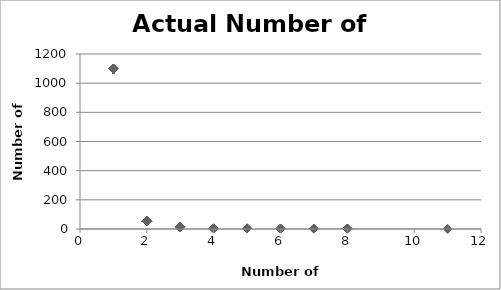
| Category | Actual Number of Athletes |
|---|---|
| 11.0 | 1 |
| 8.0 | 3 |
| 8.0 | 3 |
| 8.0 | 3 |
| 7.0 | 3 |
| 7.0 | 3 |
| 7.0 | 3 |
| 6.0 | 3 |
| 6.0 | 3 |
| 6.0 | 3 |
| 5.0 | 4 |
| 5.0 | 4 |
| 5.0 | 4 |
| 5.0 | 4 |
| 4.0 | 4 |
| 4.0 | 4 |
| 4.0 | 4 |
| 4.0 | 4 |
| 3.0 | 14 |
| 3.0 | 14 |
| 3.0 | 14 |
| 3.0 | 14 |
| 3.0 | 14 |
| 3.0 | 14 |
| 3.0 | 14 |
| 3.0 | 14 |
| 3.0 | 14 |
| 3.0 | 14 |
| 3.0 | 14 |
| 3.0 | 14 |
| 3.0 | 14 |
| 3.0 | 14 |
| 2.0 | 53 |
| 2.0 | 53 |
| 2.0 | 53 |
| 2.0 | 53 |
| 2.0 | 53 |
| 2.0 | 53 |
| 2.0 | 53 |
| 2.0 | 53 |
| 2.0 | 53 |
| 2.0 | 53 |
| 2.0 | 53 |
| 2.0 | 53 |
| 2.0 | 53 |
| 2.0 | 53 |
| 2.0 | 53 |
| 2.0 | 53 |
| 2.0 | 53 |
| 2.0 | 53 |
| 2.0 | 53 |
| 2.0 | 53 |
| 2.0 | 53 |
| 2.0 | 53 |
| 2.0 | 53 |
| 2.0 | 53 |
| 2.0 | 53 |
| 2.0 | 53 |
| 2.0 | 53 |
| 2.0 | 53 |
| 2.0 | 53 |
| 2.0 | 53 |
| 2.0 | 53 |
| 2.0 | 53 |
| 2.0 | 53 |
| 2.0 | 53 |
| 2.0 | 53 |
| 2.0 | 53 |
| 2.0 | 53 |
| 2.0 | 53 |
| 2.0 | 53 |
| 2.0 | 53 |
| 2.0 | 53 |
| 2.0 | 53 |
| 2.0 | 53 |
| 2.0 | 53 |
| 2.0 | 53 |
| 2.0 | 53 |
| 2.0 | 53 |
| 2.0 | 53 |
| 2.0 | 53 |
| 2.0 | 53 |
| 2.0 | 53 |
| 2.0 | 53 |
| 2.0 | 53 |
| 1.0 | 1098 |
| 1.0 | 1098 |
| 1.0 | 1098 |
| 1.0 | 1098 |
| 1.0 | 1098 |
| 1.0 | 1098 |
| 1.0 | 1098 |
| 1.0 | 1098 |
| 1.0 | 1098 |
| 1.0 | 1098 |
| 1.0 | 1098 |
| 1.0 | 1098 |
| 1.0 | 1098 |
| 1.0 | 1098 |
| 1.0 | 1098 |
| 1.0 | 1098 |
| 1.0 | 1098 |
| 1.0 | 1098 |
| 1.0 | 1098 |
| 1.0 | 1098 |
| 1.0 | 1098 |
| 1.0 | 1098 |
| 1.0 | 1098 |
| 1.0 | 1098 |
| 1.0 | 1098 |
| 1.0 | 1098 |
| 1.0 | 1098 |
| 1.0 | 1098 |
| 1.0 | 1098 |
| 1.0 | 1098 |
| 1.0 | 1098 |
| 1.0 | 1098 |
| 1.0 | 1098 |
| 1.0 | 1098 |
| 1.0 | 1098 |
| 1.0 | 1098 |
| 1.0 | 1098 |
| 1.0 | 1098 |
| 1.0 | 1098 |
| 1.0 | 1098 |
| 1.0 | 1098 |
| 1.0 | 1098 |
| 1.0 | 1098 |
| 1.0 | 1098 |
| 1.0 | 1098 |
| 1.0 | 1098 |
| 1.0 | 1098 |
| 1.0 | 1098 |
| 1.0 | 1098 |
| 1.0 | 1098 |
| 1.0 | 1098 |
| 1.0 | 1098 |
| 1.0 | 1098 |
| 1.0 | 1098 |
| 1.0 | 1098 |
| 1.0 | 1098 |
| 1.0 | 1098 |
| 1.0 | 1098 |
| 1.0 | 1098 |
| 1.0 | 1098 |
| 1.0 | 1098 |
| 1.0 | 1098 |
| 1.0 | 1098 |
| 1.0 | 1098 |
| 1.0 | 1098 |
| 1.0 | 1098 |
| 1.0 | 1098 |
| 1.0 | 1098 |
| 1.0 | 1098 |
| 1.0 | 1098 |
| 1.0 | 1098 |
| 1.0 | 1098 |
| 1.0 | 1098 |
| 1.0 | 1098 |
| 1.0 | 1098 |
| 1.0 | 1098 |
| 1.0 | 1098 |
| 1.0 | 1098 |
| 1.0 | 1098 |
| 1.0 | 1098 |
| 1.0 | 1098 |
| 1.0 | 1098 |
| 1.0 | 1098 |
| 1.0 | 1098 |
| 1.0 | 1098 |
| 1.0 | 1098 |
| 1.0 | 1098 |
| 1.0 | 1098 |
| 1.0 | 1098 |
| 1.0 | 1098 |
| 1.0 | 1098 |
| 1.0 | 1098 |
| 1.0 | 1098 |
| 1.0 | 1098 |
| 1.0 | 1098 |
| 1.0 | 1098 |
| 1.0 | 1098 |
| 1.0 | 1098 |
| 1.0 | 1098 |
| 1.0 | 1098 |
| 1.0 | 1098 |
| 1.0 | 1098 |
| 1.0 | 1098 |
| 1.0 | 1098 |
| 1.0 | 1098 |
| 1.0 | 1098 |
| 1.0 | 1098 |
| 1.0 | 1098 |
| 1.0 | 1098 |
| 1.0 | 1098 |
| 1.0 | 1098 |
| 1.0 | 1098 |
| 1.0 | 1098 |
| 1.0 | 1098 |
| 1.0 | 1098 |
| 1.0 | 1098 |
| 1.0 | 1098 |
| 1.0 | 1098 |
| 1.0 | 1098 |
| 1.0 | 1098 |
| 1.0 | 1098 |
| 1.0 | 1098 |
| 1.0 | 1098 |
| 1.0 | 1098 |
| 1.0 | 1098 |
| 1.0 | 1098 |
| 1.0 | 1098 |
| 1.0 | 1098 |
| 1.0 | 1098 |
| 1.0 | 1098 |
| 1.0 | 1098 |
| 1.0 | 1098 |
| 1.0 | 1098 |
| 1.0 | 1098 |
| 1.0 | 1098 |
| 1.0 | 1098 |
| 1.0 | 1098 |
| 1.0 | 1098 |
| 1.0 | 1098 |
| 1.0 | 1098 |
| 1.0 | 1098 |
| 1.0 | 1098 |
| 1.0 | 1098 |
| 1.0 | 1098 |
| 1.0 | 1098 |
| 1.0 | 1098 |
| 1.0 | 1098 |
| 1.0 | 1098 |
| 1.0 | 1098 |
| 1.0 | 1098 |
| 1.0 | 1098 |
| 1.0 | 1098 |
| 1.0 | 1098 |
| 1.0 | 1098 |
| 1.0 | 1098 |
| 1.0 | 1098 |
| 1.0 | 1098 |
| 1.0 | 1098 |
| 1.0 | 1098 |
| 1.0 | 1098 |
| 1.0 | 1098 |
| 1.0 | 1098 |
| 1.0 | 1098 |
| 1.0 | 1098 |
| 1.0 | 1098 |
| 1.0 | 1098 |
| 1.0 | 1098 |
| 1.0 | 1098 |
| 1.0 | 1098 |
| 1.0 | 1098 |
| 1.0 | 1098 |
| 1.0 | 1098 |
| 1.0 | 1098 |
| 1.0 | 1098 |
| 1.0 | 1098 |
| 1.0 | 1098 |
| 1.0 | 1098 |
| 1.0 | 1098 |
| 1.0 | 1098 |
| 1.0 | 1098 |
| 1.0 | 1098 |
| 1.0 | 1098 |
| 1.0 | 1098 |
| 1.0 | 1098 |
| 1.0 | 1098 |
| 1.0 | 1098 |
| 1.0 | 1098 |
| 1.0 | 1098 |
| 1.0 | 1098 |
| 1.0 | 1098 |
| 1.0 | 1098 |
| 1.0 | 1098 |
| 1.0 | 1098 |
| 1.0 | 1098 |
| 1.0 | 1098 |
| 1.0 | 1098 |
| 1.0 | 1098 |
| 1.0 | 1098 |
| 1.0 | 1098 |
| 1.0 | 1098 |
| 1.0 | 1098 |
| 1.0 | 1098 |
| 1.0 | 1098 |
| 1.0 | 1098 |
| 1.0 | 1098 |
| 1.0 | 1098 |
| 1.0 | 1098 |
| 1.0 | 1098 |
| 1.0 | 1098 |
| 1.0 | 1098 |
| 1.0 | 1098 |
| 1.0 | 1098 |
| 1.0 | 1098 |
| 1.0 | 1098 |
| 1.0 | 1098 |
| 1.0 | 1098 |
| 1.0 | 1098 |
| 1.0 | 1098 |
| 1.0 | 1098 |
| 1.0 | 1098 |
| 1.0 | 1098 |
| 1.0 | 1098 |
| 1.0 | 1098 |
| 1.0 | 1098 |
| 1.0 | 1098 |
| 1.0 | 1098 |
| 1.0 | 1098 |
| 1.0 | 1098 |
| 1.0 | 1098 |
| 1.0 | 1098 |
| 1.0 | 1098 |
| 1.0 | 1098 |
| 1.0 | 1098 |
| 1.0 | 1098 |
| 1.0 | 1098 |
| 1.0 | 1098 |
| 1.0 | 1098 |
| 1.0 | 1098 |
| 1.0 | 1098 |
| 1.0 | 1098 |
| 1.0 | 1098 |
| 1.0 | 1098 |
| 1.0 | 1098 |
| 1.0 | 1098 |
| 1.0 | 1098 |
| 1.0 | 1098 |
| 1.0 | 1098 |
| 1.0 | 1098 |
| 1.0 | 1098 |
| 1.0 | 1098 |
| 1.0 | 1098 |
| 1.0 | 1098 |
| 1.0 | 1098 |
| 1.0 | 1098 |
| 1.0 | 1098 |
| 1.0 | 1098 |
| 1.0 | 1098 |
| 1.0 | 1098 |
| 1.0 | 1098 |
| 1.0 | 1098 |
| 1.0 | 1098 |
| 1.0 | 1098 |
| 1.0 | 1098 |
| 1.0 | 1098 |
| 1.0 | 1098 |
| 1.0 | 1098 |
| 1.0 | 1098 |
| 1.0 | 1098 |
| 1.0 | 1098 |
| 1.0 | 1098 |
| 1.0 | 1098 |
| 1.0 | 1098 |
| 1.0 | 1098 |
| 1.0 | 1098 |
| 1.0 | 1098 |
| 1.0 | 1098 |
| 1.0 | 1098 |
| 1.0 | 1098 |
| 1.0 | 1098 |
| 1.0 | 1098 |
| 1.0 | 1098 |
| 1.0 | 1098 |
| 1.0 | 1098 |
| 1.0 | 1098 |
| 1.0 | 1098 |
| 1.0 | 1098 |
| 1.0 | 1098 |
| 1.0 | 1098 |
| 1.0 | 1098 |
| 1.0 | 1098 |
| 1.0 | 1098 |
| 1.0 | 1098 |
| 1.0 | 1098 |
| 1.0 | 1098 |
| 1.0 | 1098 |
| 1.0 | 1098 |
| 1.0 | 1098 |
| 1.0 | 1098 |
| 1.0 | 1098 |
| 1.0 | 1098 |
| 1.0 | 1098 |
| 1.0 | 1098 |
| 1.0 | 1098 |
| 1.0 | 1098 |
| 1.0 | 1098 |
| 1.0 | 1098 |
| 1.0 | 1098 |
| 1.0 | 1098 |
| 1.0 | 1098 |
| 1.0 | 1098 |
| 1.0 | 1098 |
| 1.0 | 1098 |
| 1.0 | 1098 |
| 1.0 | 1098 |
| 1.0 | 1098 |
| 1.0 | 1098 |
| 1.0 | 1098 |
| 1.0 | 1098 |
| 1.0 | 1098 |
| 1.0 | 1098 |
| 1.0 | 1098 |
| 1.0 | 1098 |
| 1.0 | 1098 |
| 1.0 | 1098 |
| 1.0 | 1098 |
| 1.0 | 1098 |
| 1.0 | 1098 |
| 1.0 | 1098 |
| 1.0 | 1098 |
| 1.0 | 1098 |
| 1.0 | 1098 |
| 1.0 | 1098 |
| 1.0 | 1098 |
| 1.0 | 1098 |
| 1.0 | 1098 |
| 1.0 | 1098 |
| 1.0 | 1098 |
| 1.0 | 1098 |
| 1.0 | 1098 |
| 1.0 | 1098 |
| 1.0 | 1098 |
| 1.0 | 1098 |
| 1.0 | 1098 |
| 1.0 | 1098 |
| 1.0 | 1098 |
| 1.0 | 1098 |
| 1.0 | 1098 |
| 1.0 | 1098 |
| 1.0 | 1098 |
| 1.0 | 1098 |
| 1.0 | 1098 |
| 1.0 | 1098 |
| 1.0 | 1098 |
| 1.0 | 1098 |
| 1.0 | 1098 |
| 1.0 | 1098 |
| 1.0 | 1098 |
| 1.0 | 1098 |
| 1.0 | 1098 |
| 1.0 | 1098 |
| 1.0 | 1098 |
| 1.0 | 1098 |
| 1.0 | 1098 |
| 1.0 | 1098 |
| 1.0 | 1098 |
| 1.0 | 1098 |
| 1.0 | 1098 |
| 1.0 | 1098 |
| 1.0 | 1098 |
| 1.0 | 1098 |
| 1.0 | 1098 |
| 1.0 | 1098 |
| 1.0 | 1098 |
| 1.0 | 1098 |
| 1.0 | 1098 |
| 1.0 | 1098 |
| 1.0 | 1098 |
| 1.0 | 1098 |
| 1.0 | 1098 |
| 1.0 | 1098 |
| 1.0 | 1098 |
| 1.0 | 1098 |
| 1.0 | 1098 |
| 1.0 | 1098 |
| 1.0 | 1098 |
| 1.0 | 1098 |
| 1.0 | 1098 |
| 1.0 | 1098 |
| 1.0 | 1098 |
| 1.0 | 1098 |
| 1.0 | 1098 |
| 1.0 | 1098 |
| 1.0 | 1098 |
| 1.0 | 1098 |
| 1.0 | 1098 |
| 1.0 | 1098 |
| 1.0 | 1098 |
| 1.0 | 1098 |
| 1.0 | 1098 |
| 1.0 | 1098 |
| 1.0 | 1098 |
| 1.0 | 1098 |
| 1.0 | 1098 |
| 1.0 | 1098 |
| 1.0 | 1098 |
| 1.0 | 1098 |
| 1.0 | 1098 |
| 1.0 | 1098 |
| 1.0 | 1098 |
| 1.0 | 1098 |
| 1.0 | 1098 |
| 1.0 | 1098 |
| 1.0 | 1098 |
| 1.0 | 1098 |
| 1.0 | 1098 |
| 1.0 | 1098 |
| 1.0 | 1098 |
| 1.0 | 1098 |
| 1.0 | 1098 |
| 1.0 | 1098 |
| 1.0 | 1098 |
| 1.0 | 1098 |
| 1.0 | 1098 |
| 1.0 | 1098 |
| 1.0 | 1098 |
| 1.0 | 1098 |
| 1.0 | 1098 |
| 1.0 | 1098 |
| 1.0 | 1098 |
| 1.0 | 1098 |
| 1.0 | 1098 |
| 1.0 | 1098 |
| 1.0 | 1098 |
| 1.0 | 1098 |
| 1.0 | 1098 |
| 1.0 | 1098 |
| 1.0 | 1098 |
| 1.0 | 1098 |
| 1.0 | 1098 |
| 1.0 | 1098 |
| 1.0 | 1098 |
| 1.0 | 1098 |
| 1.0 | 1098 |
| 1.0 | 1098 |
| 1.0 | 1098 |
| 1.0 | 1098 |
| 1.0 | 1098 |
| 1.0 | 1098 |
| 1.0 | 1098 |
| 1.0 | 1098 |
| 1.0 | 1098 |
| 1.0 | 1098 |
| 1.0 | 1098 |
| 1.0 | 1098 |
| 1.0 | 1098 |
| 1.0 | 1098 |
| 1.0 | 1098 |
| 1.0 | 1098 |
| 1.0 | 1098 |
| 1.0 | 1098 |
| 1.0 | 1098 |
| 1.0 | 1098 |
| 1.0 | 1098 |
| 1.0 | 1098 |
| 1.0 | 1098 |
| 1.0 | 1098 |
| 1.0 | 1098 |
| 1.0 | 1098 |
| 1.0 | 1098 |
| 1.0 | 1098 |
| 1.0 | 1098 |
| 1.0 | 1098 |
| 1.0 | 1098 |
| 1.0 | 1098 |
| 1.0 | 1098 |
| 1.0 | 1098 |
| 1.0 | 1098 |
| 1.0 | 1098 |
| 1.0 | 1098 |
| 1.0 | 1098 |
| 1.0 | 1098 |
| 1.0 | 1098 |
| 1.0 | 1098 |
| 1.0 | 1098 |
| 1.0 | 1098 |
| 1.0 | 1098 |
| 1.0 | 1098 |
| 1.0 | 1098 |
| 1.0 | 1098 |
| 1.0 | 1098 |
| 1.0 | 1098 |
| 1.0 | 1098 |
| 1.0 | 1098 |
| 1.0 | 1098 |
| 1.0 | 1098 |
| 1.0 | 1098 |
| 1.0 | 1098 |
| 1.0 | 1098 |
| 1.0 | 1098 |
| 1.0 | 1098 |
| 1.0 | 1098 |
| 1.0 | 1098 |
| 1.0 | 1098 |
| 1.0 | 1098 |
| 1.0 | 1098 |
| 1.0 | 1098 |
| 1.0 | 1098 |
| 1.0 | 1098 |
| 1.0 | 1098 |
| 1.0 | 1098 |
| 1.0 | 1098 |
| 1.0 | 1098 |
| 1.0 | 1098 |
| 1.0 | 1098 |
| 1.0 | 1098 |
| 1.0 | 1098 |
| 1.0 | 1098 |
| 1.0 | 1098 |
| 1.0 | 1098 |
| 1.0 | 1098 |
| 1.0 | 1098 |
| 1.0 | 1098 |
| 1.0 | 1098 |
| 1.0 | 1098 |
| 1.0 | 1098 |
| 1.0 | 1098 |
| 1.0 | 1098 |
| 1.0 | 1098 |
| 1.0 | 1098 |
| 1.0 | 1098 |
| 1.0 | 1098 |
| 1.0 | 1098 |
| 1.0 | 1098 |
| 1.0 | 1098 |
| 1.0 | 1098 |
| 1.0 | 1098 |
| 1.0 | 1098 |
| 1.0 | 1098 |
| 1.0 | 1098 |
| 1.0 | 1098 |
| 1.0 | 1098 |
| 1.0 | 1098 |
| 1.0 | 1098 |
| 1.0 | 1098 |
| 1.0 | 1098 |
| 1.0 | 1098 |
| 1.0 | 1098 |
| 1.0 | 1098 |
| 1.0 | 1098 |
| 1.0 | 1098 |
| 1.0 | 1098 |
| 1.0 | 1098 |
| 1.0 | 1098 |
| 1.0 | 1098 |
| 1.0 | 1098 |
| 1.0 | 1098 |
| 1.0 | 1098 |
| 1.0 | 1098 |
| 1.0 | 1098 |
| 1.0 | 1098 |
| 1.0 | 1098 |
| 1.0 | 1098 |
| 1.0 | 1098 |
| 1.0 | 1098 |
| 1.0 | 1098 |
| 1.0 | 1098 |
| 1.0 | 1098 |
| 1.0 | 1098 |
| 1.0 | 1098 |
| 1.0 | 1098 |
| 1.0 | 1098 |
| 1.0 | 1098 |
| 1.0 | 1098 |
| 1.0 | 1098 |
| 1.0 | 1098 |
| 1.0 | 1098 |
| 1.0 | 1098 |
| 1.0 | 1098 |
| 1.0 | 1098 |
| 1.0 | 1098 |
| 1.0 | 1098 |
| 1.0 | 1098 |
| 1.0 | 1098 |
| 1.0 | 1098 |
| 1.0 | 1098 |
| 1.0 | 1098 |
| 1.0 | 1098 |
| 1.0 | 1098 |
| 1.0 | 1098 |
| 1.0 | 1098 |
| 1.0 | 1098 |
| 1.0 | 1098 |
| 1.0 | 1098 |
| 1.0 | 1098 |
| 1.0 | 1098 |
| 1.0 | 1098 |
| 1.0 | 1098 |
| 1.0 | 1098 |
| 1.0 | 1098 |
| 1.0 | 1098 |
| 1.0 | 1098 |
| 1.0 | 1098 |
| 1.0 | 1098 |
| 1.0 | 1098 |
| 1.0 | 1098 |
| 1.0 | 1098 |
| 1.0 | 1098 |
| 1.0 | 1098 |
| 1.0 | 1098 |
| 1.0 | 1098 |
| 1.0 | 1098 |
| 1.0 | 1098 |
| 1.0 | 1098 |
| 1.0 | 1098 |
| 1.0 | 1098 |
| 1.0 | 1098 |
| 1.0 | 1098 |
| 1.0 | 1098 |
| 1.0 | 1098 |
| 1.0 | 1098 |
| 1.0 | 1098 |
| 1.0 | 1098 |
| 1.0 | 1098 |
| 1.0 | 1098 |
| 1.0 | 1098 |
| 1.0 | 1098 |
| 1.0 | 1098 |
| 1.0 | 1098 |
| 1.0 | 1098 |
| 1.0 | 1098 |
| 1.0 | 1098 |
| 1.0 | 1098 |
| 1.0 | 1098 |
| 1.0 | 1098 |
| 1.0 | 1098 |
| 1.0 | 1098 |
| 1.0 | 1098 |
| 1.0 | 1098 |
| 1.0 | 1098 |
| 1.0 | 1098 |
| 1.0 | 1098 |
| 1.0 | 1098 |
| 1.0 | 1098 |
| 1.0 | 1098 |
| 1.0 | 1098 |
| 1.0 | 1098 |
| 1.0 | 1098 |
| 1.0 | 1098 |
| 1.0 | 1098 |
| 1.0 | 1098 |
| 1.0 | 1098 |
| 1.0 | 1098 |
| 1.0 | 1098 |
| 1.0 | 1098 |
| 1.0 | 1098 |
| 1.0 | 1098 |
| 1.0 | 1098 |
| 1.0 | 1098 |
| 1.0 | 1098 |
| 1.0 | 1098 |
| 1.0 | 1098 |
| 1.0 | 1098 |
| 1.0 | 1098 |
| 1.0 | 1098 |
| 1.0 | 1098 |
| 1.0 | 1098 |
| 1.0 | 1098 |
| 1.0 | 1098 |
| 1.0 | 1098 |
| 1.0 | 1098 |
| 1.0 | 1098 |
| 1.0 | 1098 |
| 1.0 | 1098 |
| 1.0 | 1098 |
| 1.0 | 1098 |
| 1.0 | 1098 |
| 1.0 | 1098 |
| 1.0 | 1098 |
| 1.0 | 1098 |
| 1.0 | 1098 |
| 1.0 | 1098 |
| 1.0 | 1098 |
| 1.0 | 1098 |
| 1.0 | 1098 |
| 1.0 | 1098 |
| 1.0 | 1098 |
| 1.0 | 1098 |
| 1.0 | 1098 |
| 1.0 | 1098 |
| 1.0 | 1098 |
| 1.0 | 1098 |
| 1.0 | 1098 |
| 1.0 | 1098 |
| 1.0 | 1098 |
| 1.0 | 1098 |
| 1.0 | 1098 |
| 1.0 | 1098 |
| 1.0 | 1098 |
| 1.0 | 1098 |
| 1.0 | 1098 |
| 1.0 | 1098 |
| 1.0 | 1098 |
| 1.0 | 1098 |
| 1.0 | 1098 |
| 1.0 | 1098 |
| 1.0 | 1098 |
| 1.0 | 1098 |
| 1.0 | 1098 |
| 1.0 | 1098 |
| 1.0 | 1098 |
| 1.0 | 1098 |
| 1.0 | 1098 |
| 1.0 | 1098 |
| 1.0 | 1098 |
| 1.0 | 1098 |
| 1.0 | 1098 |
| 1.0 | 1098 |
| 1.0 | 1098 |
| 1.0 | 1098 |
| 1.0 | 1098 |
| 1.0 | 1098 |
| 1.0 | 1098 |
| 1.0 | 1098 |
| 1.0 | 1098 |
| 1.0 | 1098 |
| 1.0 | 1098 |
| 1.0 | 1098 |
| 1.0 | 1098 |
| 1.0 | 1098 |
| 1.0 | 1098 |
| 1.0 | 1098 |
| 1.0 | 1098 |
| 1.0 | 1098 |
| 1.0 | 1098 |
| 1.0 | 1098 |
| 1.0 | 1098 |
| 1.0 | 1098 |
| 1.0 | 1098 |
| 1.0 | 1098 |
| 1.0 | 1098 |
| 1.0 | 1098 |
| 1.0 | 1098 |
| 1.0 | 1098 |
| 1.0 | 1098 |
| 1.0 | 1098 |
| 1.0 | 1098 |
| 1.0 | 1098 |
| 1.0 | 1098 |
| 1.0 | 1098 |
| 1.0 | 1098 |
| 1.0 | 1098 |
| 1.0 | 1098 |
| 1.0 | 1098 |
| 1.0 | 1098 |
| 1.0 | 1098 |
| 1.0 | 1098 |
| 1.0 | 1098 |
| 1.0 | 1098 |
| 1.0 | 1098 |
| 1.0 | 1098 |
| 1.0 | 1098 |
| 1.0 | 1098 |
| 1.0 | 1098 |
| 1.0 | 1098 |
| 1.0 | 1098 |
| 1.0 | 1098 |
| 1.0 | 1098 |
| 1.0 | 1098 |
| 1.0 | 1098 |
| 1.0 | 1098 |
| 1.0 | 1098 |
| 1.0 | 1098 |
| 1.0 | 1098 |
| 1.0 | 1098 |
| 1.0 | 1098 |
| 1.0 | 1098 |
| 1.0 | 1098 |
| 1.0 | 1098 |
| 1.0 | 1098 |
| 1.0 | 1098 |
| 1.0 | 1098 |
| 1.0 | 1098 |
| 1.0 | 1098 |
| 1.0 | 1098 |
| 1.0 | 1098 |
| 1.0 | 1098 |
| 1.0 | 1098 |
| 1.0 | 1098 |
| 1.0 | 1098 |
| 1.0 | 1098 |
| 1.0 | 1098 |
| 1.0 | 1098 |
| 1.0 | 1098 |
| 1.0 | 1098 |
| 1.0 | 1098 |
| 1.0 | 1098 |
| 1.0 | 1098 |
| 1.0 | 1098 |
| 1.0 | 1098 |
| 1.0 | 1098 |
| 1.0 | 1098 |
| 1.0 | 1098 |
| 1.0 | 1098 |
| 1.0 | 1098 |
| 1.0 | 1098 |
| 1.0 | 1098 |
| 1.0 | 1098 |
| 1.0 | 1098 |
| 1.0 | 1098 |
| 1.0 | 1098 |
| 1.0 | 1098 |
| 1.0 | 1098 |
| 1.0 | 1098 |
| 1.0 | 1098 |
| 1.0 | 1098 |
| 1.0 | 1098 |
| 1.0 | 1098 |
| 1.0 | 1098 |
| 1.0 | 1098 |
| 1.0 | 1098 |
| 1.0 | 1098 |
| 1.0 | 1098 |
| 1.0 | 1098 |
| 1.0 | 1098 |
| 1.0 | 1098 |
| 1.0 | 1098 |
| 1.0 | 1098 |
| 1.0 | 1098 |
| 1.0 | 1098 |
| 1.0 | 1098 |
| 1.0 | 1098 |
| 1.0 | 1098 |
| 1.0 | 1098 |
| 1.0 | 1098 |
| 1.0 | 1098 |
| 1.0 | 1098 |
| 1.0 | 1098 |
| 1.0 | 1098 |
| 1.0 | 1098 |
| 1.0 | 1098 |
| 1.0 | 1098 |
| 1.0 | 1098 |
| 1.0 | 1098 |
| 1.0 | 1098 |
| 1.0 | 1098 |
| 1.0 | 1098 |
| 1.0 | 1098 |
| 1.0 | 1098 |
| 1.0 | 1098 |
| 1.0 | 1098 |
| 1.0 | 1098 |
| 1.0 | 1098 |
| 1.0 | 1098 |
| 1.0 | 1098 |
| 1.0 | 1098 |
| 1.0 | 1098 |
| 1.0 | 1098 |
| 1.0 | 1098 |
| 1.0 | 1098 |
| 1.0 | 1098 |
| 1.0 | 1098 |
| 1.0 | 1098 |
| 1.0 | 1098 |
| 1.0 | 1098 |
| 1.0 | 1098 |
| 1.0 | 1098 |
| 1.0 | 1098 |
| 1.0 | 1098 |
| 1.0 | 1098 |
| 1.0 | 1098 |
| 1.0 | 1098 |
| 1.0 | 1098 |
| 1.0 | 1098 |
| 1.0 | 1098 |
| 1.0 | 1098 |
| 1.0 | 1098 |
| 1.0 | 1098 |
| 1.0 | 1098 |
| 1.0 | 1098 |
| 1.0 | 1098 |
| 1.0 | 1098 |
| 1.0 | 1098 |
| 1.0 | 1098 |
| 1.0 | 1098 |
| 1.0 | 1098 |
| 1.0 | 1098 |
| 1.0 | 1098 |
| 1.0 | 1098 |
| 1.0 | 1098 |
| 1.0 | 1098 |
| 1.0 | 1098 |
| 1.0 | 1098 |
| 1.0 | 1098 |
| 1.0 | 1098 |
| 1.0 | 1098 |
| 1.0 | 1098 |
| 1.0 | 1098 |
| 1.0 | 1098 |
| 1.0 | 1098 |
| 1.0 | 1098 |
| 1.0 | 1098 |
| 1.0 | 1098 |
| 1.0 | 1098 |
| 1.0 | 1098 |
| 1.0 | 1098 |
| 1.0 | 1098 |
| 1.0 | 1098 |
| 1.0 | 1098 |
| 1.0 | 1098 |
| 1.0 | 1098 |
| 1.0 | 1098 |
| 1.0 | 1098 |
| 1.0 | 1098 |
| 1.0 | 1098 |
| 1.0 | 1098 |
| 1.0 | 1098 |
| 1.0 | 1098 |
| 1.0 | 1098 |
| 1.0 | 1098 |
| 1.0 | 1098 |
| 1.0 | 1098 |
| 1.0 | 1098 |
| 1.0 | 1098 |
| 1.0 | 1098 |
| 1.0 | 1098 |
| 1.0 | 1098 |
| 1.0 | 1098 |
| 1.0 | 1098 |
| 1.0 | 1098 |
| 1.0 | 1098 |
| 1.0 | 1098 |
| 1.0 | 1098 |
| 1.0 | 1098 |
| 1.0 | 1098 |
| 1.0 | 1098 |
| 1.0 | 1098 |
| 1.0 | 1098 |
| 1.0 | 1098 |
| 1.0 | 1098 |
| 1.0 | 1098 |
| 1.0 | 1098 |
| 1.0 | 1098 |
| 1.0 | 1098 |
| 1.0 | 1098 |
| 1.0 | 1098 |
| 1.0 | 1098 |
| 1.0 | 1098 |
| 1.0 | 1098 |
| 1.0 | 1098 |
| 1.0 | 1098 |
| 1.0 | 1098 |
| 1.0 | 1098 |
| 1.0 | 1098 |
| 1.0 | 1098 |
| 1.0 | 1098 |
| 1.0 | 1098 |
| 1.0 | 1098 |
| 1.0 | 1098 |
| 1.0 | 1098 |
| 1.0 | 1098 |
| 1.0 | 1098 |
| 1.0 | 1098 |
| 1.0 | 1098 |
| 1.0 | 1098 |
| 1.0 | 1098 |
| 1.0 | 1098 |
| 1.0 | 1098 |
| 1.0 | 1098 |
| 1.0 | 1098 |
| 1.0 | 1098 |
| 1.0 | 1098 |
| 1.0 | 1098 |
| 1.0 | 1098 |
| 1.0 | 1098 |
| 1.0 | 1098 |
| 1.0 | 1098 |
| 1.0 | 1098 |
| 1.0 | 1098 |
| 1.0 | 1098 |
| 1.0 | 1098 |
| 1.0 | 1098 |
| 1.0 | 1098 |
| 1.0 | 1098 |
| 1.0 | 1098 |
| 1.0 | 1098 |
| 1.0 | 1098 |
| 1.0 | 1098 |
| 1.0 | 1098 |
| 1.0 | 1098 |
| 1.0 | 1098 |
| 1.0 | 1098 |
| 1.0 | 1098 |
| 1.0 | 1098 |
| 1.0 | 1098 |
| 1.0 | 1098 |
| 1.0 | 1098 |
| 1.0 | 1098 |
| 1.0 | 1098 |
| 1.0 | 1098 |
| 1.0 | 1098 |
| 1.0 | 1098 |
| 1.0 | 1098 |
| 1.0 | 1098 |
| 1.0 | 1098 |
| 1.0 | 1098 |
| 1.0 | 1098 |
| 1.0 | 1098 |
| 1.0 | 1098 |
| 1.0 | 1098 |
| 1.0 | 1098 |
| 1.0 | 1098 |
| 1.0 | 1098 |
| 1.0 | 1098 |
| 1.0 | 1098 |
| 1.0 | 1098 |
| 1.0 | 1098 |
| 1.0 | 1098 |
| 1.0 | 1098 |
| 1.0 | 1098 |
| 1.0 | 1098 |
| 1.0 | 1098 |
| 1.0 | 1098 |
| 1.0 | 1098 |
| 1.0 | 1098 |
| 1.0 | 1098 |
| 1.0 | 1098 |
| 1.0 | 1098 |
| 1.0 | 1098 |
| 1.0 | 1098 |
| 1.0 | 1098 |
| 1.0 | 1098 |
| 1.0 | 1098 |
| 1.0 | 1098 |
| 1.0 | 1098 |
| 1.0 | 1098 |
| 1.0 | 1098 |
| 1.0 | 1098 |
| 1.0 | 1098 |
| 1.0 | 1098 |
| 1.0 | 1098 |
| 1.0 | 1098 |
| 1.0 | 1098 |
| 1.0 | 1098 |
| 1.0 | 1098 |
| 1.0 | 1098 |
| 1.0 | 1098 |
| 1.0 | 1098 |
| 1.0 | 1098 |
| 1.0 | 1098 |
| 1.0 | 1098 |
| 1.0 | 1098 |
| 1.0 | 1098 |
| 1.0 | 1098 |
| 1.0 | 1098 |
| 1.0 | 1098 |
| 1.0 | 1098 |
| 1.0 | 1098 |
| 1.0 | 1098 |
| 1.0 | 1098 |
| 1.0 | 1098 |
| 1.0 | 1098 |
| 1.0 | 1098 |
| 1.0 | 1098 |
| 1.0 | 1098 |
| 1.0 | 1098 |
| 1.0 | 1098 |
| 1.0 | 1098 |
| 1.0 | 1098 |
| 1.0 | 1098 |
| 1.0 | 1098 |
| 1.0 | 1098 |
| 1.0 | 1098 |
| 1.0 | 1098 |
| 1.0 | 1098 |
| 1.0 | 1098 |
| 1.0 | 1098 |
| 1.0 | 1098 |
| 1.0 | 1098 |
| 1.0 | 1098 |
| 1.0 | 1098 |
| 1.0 | 1098 |
| 1.0 | 1098 |
| 1.0 | 1098 |
| 1.0 | 1098 |
| 1.0 | 1098 |
| 1.0 | 1098 |
| 1.0 | 1098 |
| 1.0 | 1098 |
| 1.0 | 1098 |
| 1.0 | 1098 |
| 1.0 | 1098 |
| 1.0 | 1098 |
| 1.0 | 1098 |
| 1.0 | 1098 |
| 1.0 | 1098 |
| 1.0 | 1098 |
| 1.0 | 1098 |
| 1.0 | 1098 |